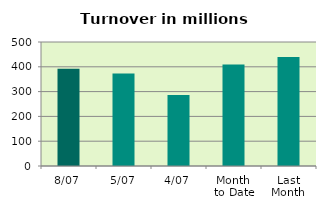
| Category | Series 0 |
|---|---|
| 8/07 | 392.129 |
| 5/07 | 373.462 |
| 4/07 | 285.955 |
| Month 
to Date | 408.9 |
| Last
Month | 439.695 |